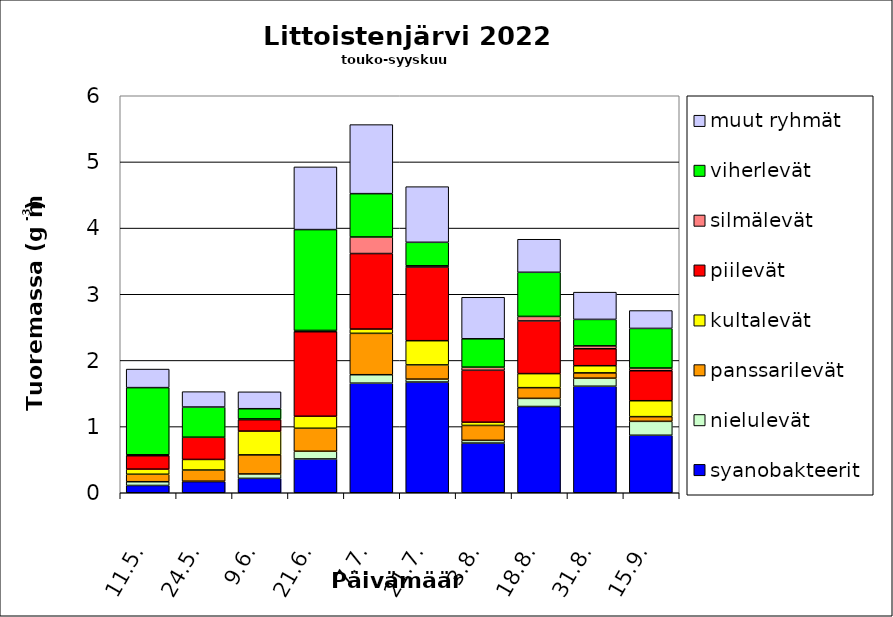
| Category | syanobakteerit | nielulevät | panssarilevät | kultalevät | piilevät | silmälevät | viherlevät | muut ryhmät |
|---|---|---|---|---|---|---|---|---|
| 11.5. | 0.11 | 0.056 | 0.113 | 0.077 | 0.203 | 0.014 | 1.015 | 0.28 |
| 24.5. | 0.168 | 0.006 | 0.169 | 0.16 | 0.335 | 0.001 | 0.456 | 0.233 |
| 9.6. | 0.217 | 0.067 | 0.288 | 0.359 | 0.172 | 0.012 | 0.154 | 0.255 |
| 21.6. | 0.511 | 0.116 | 0.348 | 0.181 | 1.278 | 0.019 | 1.524 | 0.948 |
| 7.7. | 1.656 | 0.128 | 0.625 | 0.065 | 1.141 | 0.25 | 0.655 | 1.044 |
| 21.7. | 1.673 | 0.044 | 0.215 | 0.366 | 1.113 | 0.019 | 0.355 | 0.841 |
| 3.8. | 0.751 | 0.041 | 0.225 | 0.048 | 0.785 | 0.047 | 0.429 | 0.627 |
| 18.8. | 1.303 | 0.123 | 0.162 | 0.212 | 0.796 | 0.068 | 0.667 | 0.499 |
| 31.8. | 1.61 | 0.121 | 0.081 | 0.108 | 0.256 | 0.044 | 0.4 | 0.412 |
| 15.9. | 0.869 | 0.211 | 0.071 | 0.241 | 0.453 | 0.041 | 0.599 | 0.27 |